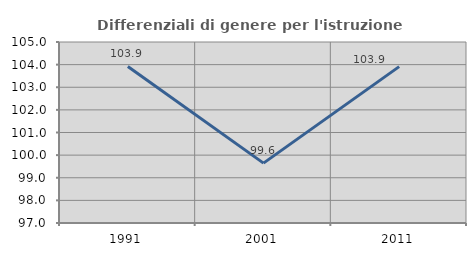
| Category | Differenziali di genere per l'istruzione superiore |
|---|---|
| 1991.0 | 103.919 |
| 2001.0 | 99.646 |
| 2011.0 | 103.911 |